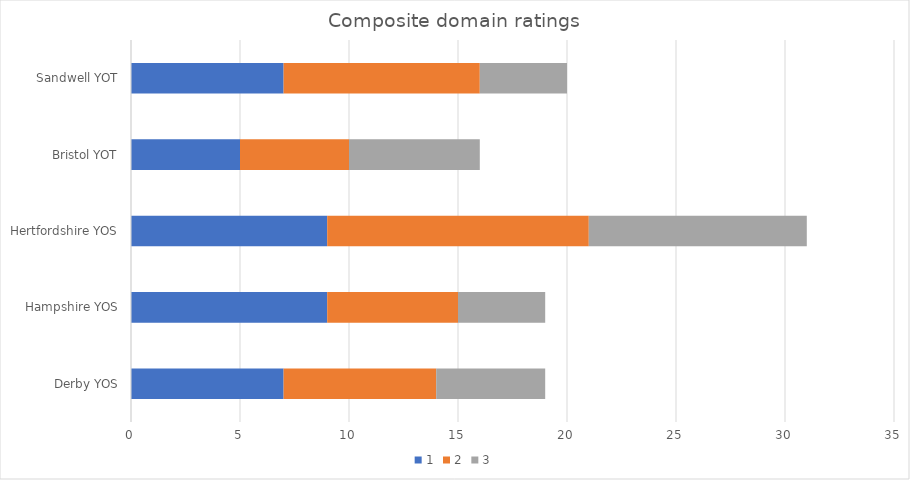
| Category | 1 | 2 | 3 |
|---|---|---|---|
| Derby YOS | 7 | 7 | 5 |
| Hampshire YOS | 9 | 6 | 4 |
| Hertfordshire YOS | 9 | 12 | 10 |
| Bristol YOT | 5 | 5 | 6 |
| Sandwell YOT | 7 | 9 | 4 |